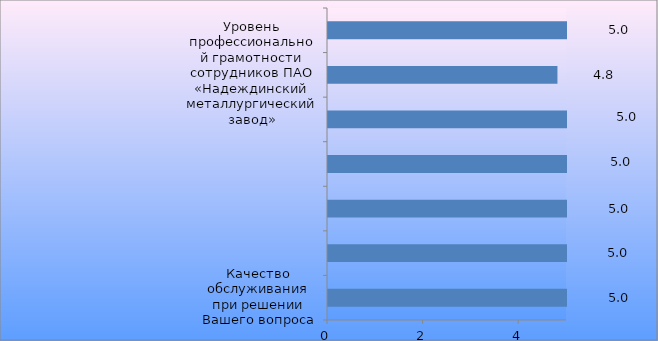
| Category | Series 0 |
|---|---|
| Качество обслуживания при решении Вашего вопроса | 5 |
| Уровень качества энергоснабжения Вашего объекта (помещения и пр.) | 5 |
| Уровень безопасности энергоснабжения Вашего объекта (помещения и пр.) | 5 |
| Уровень оперативности сотрудников ПАО «Надеждинский металлургический завод» при устранении причин перерывов в электроснабжении Вашего объекта (помещения и пр.) | 5 |
| Уровень открытости и доступности информации о деятельности ПАО «Надеждинский металлургический завод» | 5 |
| Уровень профессиональной грамотности сотрудников ПАО «Надеждинский металлургический завод» | 4.8 |
| Уровень вежливости и клиентоориентированности сотрудников ПАО «Надеждинский металлургический завод» | 5 |